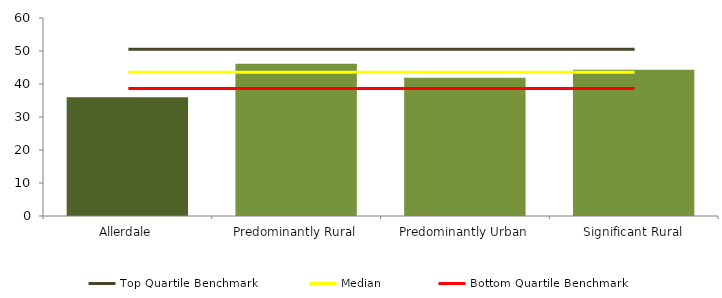
| Category | Series 0 |
|---|---|
| Allerdale | 36 |
| Predominantly Rural | 46.121 |
| Predominantly Urban | 41.881 |
| Significant Rural | 44.321 |